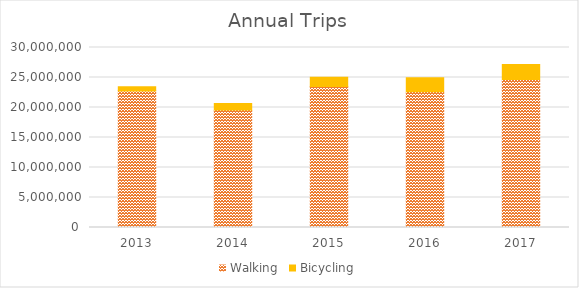
| Category | Walking | Bicycling |
|---|---|---|
| 2013 | 22751925.576 | 713664.531 |
| 2014 | 19599859.262 | 1083156.888 |
| 2015 | 23511045.522 | 1537227.401 |
| 2016 | 22618059.244 | 2351952.632 |
| 2017 | 24685843.788 | 2465253.872 |